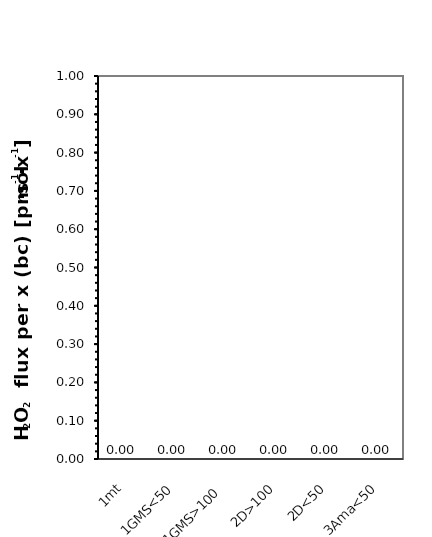
| Category | J°1 |
|---|---|
| 1mt | 0 |
| 1GMS<50 | 0 |
| 1GMS>100 | 0 |
| 2D>100 | 0 |
| 2D<50 | 0 |
| 3Ama<50 | 0 |